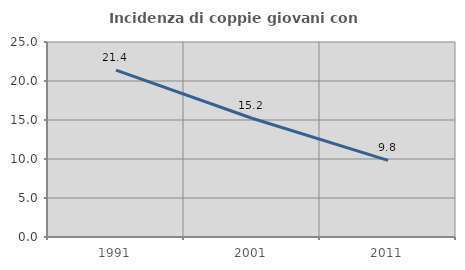
| Category | Incidenza di coppie giovani con figli |
|---|---|
| 1991.0 | 21.396 |
| 2001.0 | 15.222 |
| 2011.0 | 9.821 |